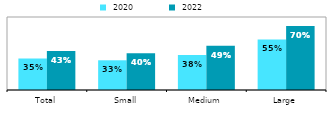
| Category |  2020 |  2022 |
|---|---|---|
| Total | 0.345 | 0.428 |
| Small | 0.326 | 0.403 |
| Medium | 0.385 | 0.486 |
| Large | 0.554 | 0.702 |